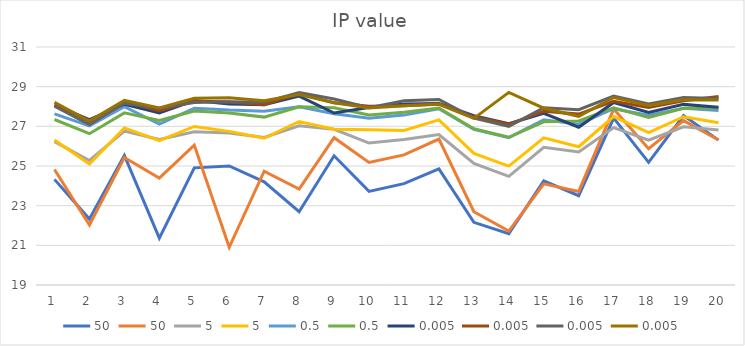
| Category | 50 | 5 | 0.5 | 0.005 |
|---|---|---|---|---|
| 1.0 | 24.826 | 26.316 | 27.344 | 28.208 |
| 2.0 | 22.022 | 25.105 | 26.63 | 27.261 |
| 3.0 | 25.425 | 26.921 | 27.679 | 28.307 |
| 4.0 | 24.393 | 26.279 | 27.301 | 27.922 |
| 5.0 | 26.055 | 26.996 | 27.773 | 28.416 |
| 6.0 | 20.9 | 26.746 | 27.676 | 28.438 |
| 7.0 | 24.736 | 26.399 | 27.465 | 28.296 |
| 8.0 | 23.833 | 27.245 | 27.99 | 28.6 |
| 9.0 | 26.429 | 26.852 | 27.933 | 28.19 |
| 10.0 | 25.184 | 26.822 | 27.568 | 27.923 |
| 11.0 | 25.559 | 26.791 | 27.712 | 28.04 |
| 12.0 | 26.358 | 27.326 | 27.917 | 28.109 |
| 13.0 | 22.696 | 25.634 | 26.878 | 27.4 |
| 14.0 | 21.716 | 24.993 | 26.449 | 28.712 |
| 15.0 | 24.1 | 26.422 | 27.229 | 27.912 |
| 16.0 | 23.717 | 25.97 | 27.271 | 27.505 |
| 17.0 | 27.87 | 27.49 | 27.939 | 28.452 |
| 18.0 | 25.876 | 26.679 | 27.45 | 28.057 |
| 19.0 | 27.287 | 27.485 | 27.91 | 28.342 |
| 20.0 | 26.312 | 27.185 | 27.921 | 28.333 |